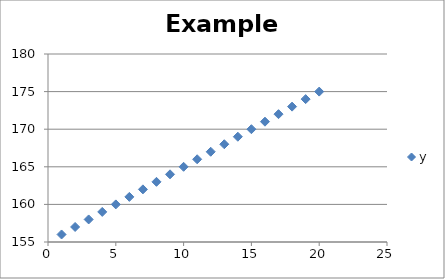
| Category | y |
|---|---|
| 1.0 | 156 |
| 2.0 | 157 |
| 3.0 | 158 |
| 4.0 | 159 |
| 5.0 | 160 |
| 6.0 | 161 |
| 7.0 | 162 |
| 8.0 | 163 |
| 9.0 | 164 |
| 10.0 | 165 |
| 11.0 | 166 |
| 12.0 | 167 |
| 13.0 | 168 |
| 14.0 | 169 |
| 15.0 | 170 |
| 16.0 | 171 |
| 17.0 | 172 |
| 18.0 | 173 |
| 19.0 | 174 |
| 20.0 | 175 |